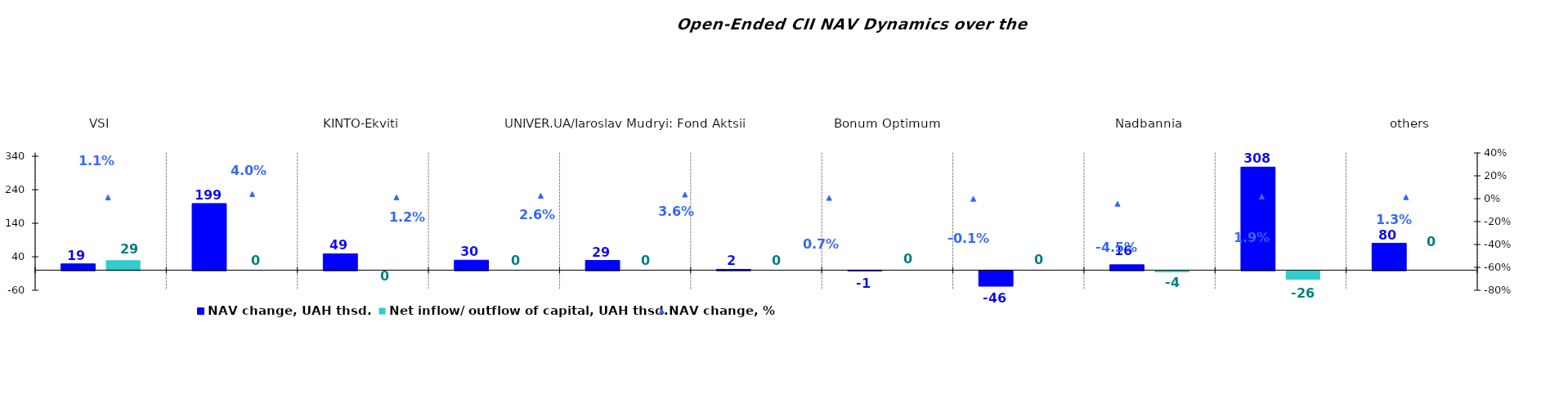
| Category | NAV change, UAH thsd. | Net inflow/ outflow of capital, UAH thsd. |
|---|---|---|
| VSI | 18.804 | 29.462 |
| Sofiivskyi | 198.889 | 0 |
| KINTO-Ekviti | 48.857 | 0 |
| UNIVER.UA/Volodymyr Velykyi: Fond Zbalansovanyi | 29.716 | 0 |
| UNIVER.UA/Iaroslav Mudryi: Fond Aktsii | 28.893 | 0 |
| Altus-Stratehichnyi | 2.377 | 0 |
| Bonum Optimum | -0.687 | 0 |
| ТАSK Resurs | -46.236 | 0 |
| Nadbannia | 16.021 | -3.929 |
| KINTO-Klasychnyi | 307.66 | -25.673 |
| others | 80.065 | 0 |